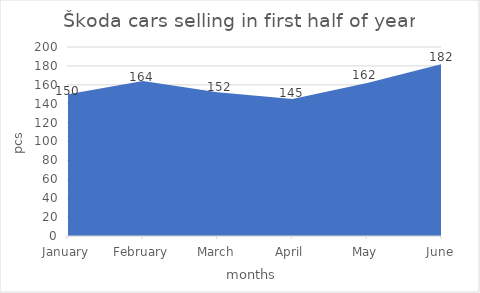
| Category | Škoda |
|---|---|
| January | 150 |
| February | 164 |
| March | 152 |
| April | 145 |
| May | 162 |
| June | 182 |